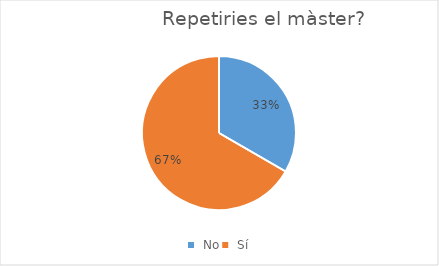
| Category | Series 0 |
|---|---|
|  No | 3 |
|  Sí | 6 |